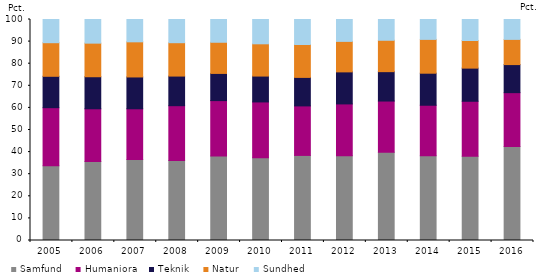
| Category | Samfund | Humaniora | Teknik | Natur | Sundhed |
|---|---|---|---|---|---|
| 2005.0 | 33.8 | 26.3 | 14.2 | 15.2 | 10.6 |
| 2006.0 | 35.8 | 23.8 | 14.5 | 15.2 | 10.7 |
| 2007.0 | 36.6 | 23 | 14.4 | 15.9 | 10.1 |
| 2008.0 | 36.2 | 24.8 | 13.4 | 15.1 | 10.5 |
| 2009.0 | 38.2 | 25.1 | 12.3 | 14.1 | 10.3 |
| 2010.0 | 37.5 | 25.2 | 11.7 | 14.6 | 11.1 |
| 2011.0 | 38.5 | 22.4 | 12.9 | 14.9 | 11.3 |
| 2012.0 | 38.4 | 23.4 | 14.5 | 13.8 | 10 |
| 2013.0 | 39.9 | 23.2 | 13.3 | 14.2 | 9.5 |
| 2014.0 | 38.4 | 22.8 | 14.5 | 15.3 | 9 |
| 2015.0 | 38.1 | 24.9 | 15 | 12.5 | 9.5 |
| 2016.0 | 42.5 | 24.4 | 12.7 | 11.4 | 9.1 |